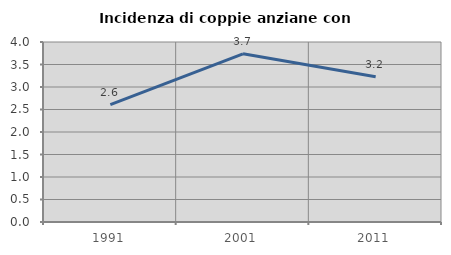
| Category | Incidenza di coppie anziane con figli |
|---|---|
| 1991.0 | 2.609 |
| 2001.0 | 3.738 |
| 2011.0 | 3.226 |